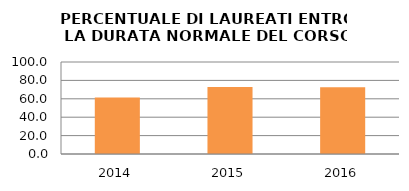
| Category | 2014 2015 2016 |
|---|---|
| 2014.0 | 61.29 |
| 2015.0 | 72.727 |
| 2016.0 | 72.603 |